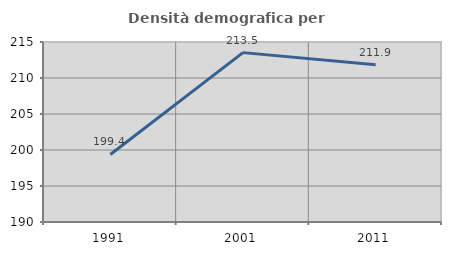
| Category | Densità demografica |
|---|---|
| 1991.0 | 199.38 |
| 2001.0 | 213.525 |
| 2011.0 | 211.856 |